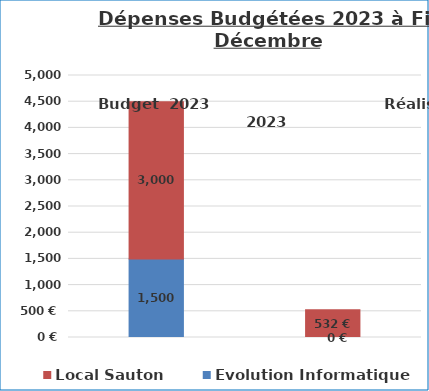
| Category | Evolution Informatique | Local Sauton |
|---|---|---|
| Budget | 1500 | 3000 |
| 2023 | 0 | 531.82 |